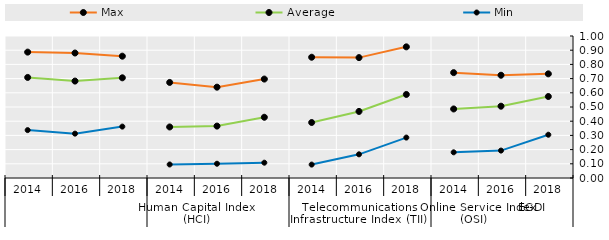
| Category | Max | Average | Min |
|---|---|---|---|
| 0 | 0.734 | 0.574 | 0.305 |
| 1 | 0.724 | 0.506 | 0.193 |
| 2 | 0.742 | 0.486 | 0.181 |
| 3 | 0.924 | 0.588 | 0.285 |
| 4 | 0.848 | 0.469 | 0.167 |
| 5 | 0.85 | 0.391 | 0.094 |
| 6 | 0.697 | 0.428 | 0.108 |
| 7 | 0.64 | 0.366 | 0.1 |
| 8 | 0.673 | 0.359 | 0.095 |
| 9 | 0.858 | 0.706 | 0.362 |
| 10 | 0.88 | 0.683 | 0.312 |
| 11 | 0.886 | 0.708 | 0.337 |